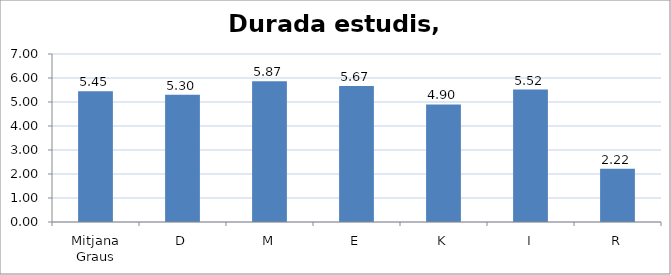
| Category | Durada estudis, anys |
|---|---|
| Mitjana Graus | 5.451 |
| D | 5.298 |
| M | 5.867 |
| E | 5.671 |
| K | 4.9 |
| I | 5.518 |
| R | 2.216 |